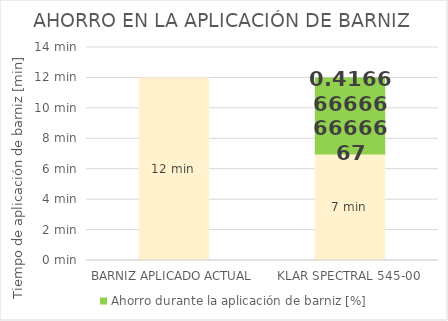
| Category | Tiempo de aplicación de barniz [min] | Ahorro durante la aplicación de barniz [%] |
|---|---|---|
| BARNIZ APLICADO ACTUAL | 12 | 0 |
| KLAR SPECTRAL 545-00 | 7 | 5 |